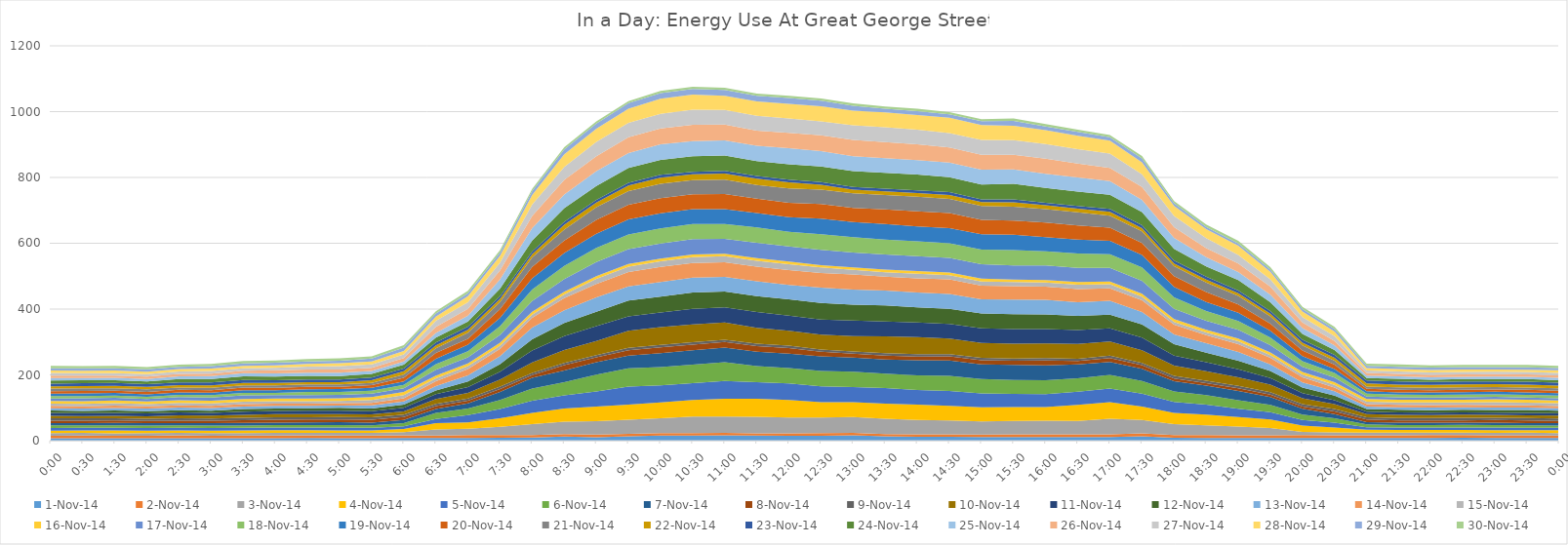
| Category | 01-Nov-14 | 02-Nov-14 | 03-Nov-14 | 04-Nov-14 | 05-Nov-14 | 06-Nov-14 | 07-Nov-14 | 08-Nov-14 | 09-Nov-14 | 10-Nov-14 | 11-Nov-14 | 12-Nov-14 | 13-Nov-14 | 14-Nov-14 | 15-Nov-14 | 16-Nov-14 | 17-Nov-14 | 18-Nov-14 | 19-Nov-14 | 20-Nov-14 | 21-Nov-14 | 22-Nov-14 | 23-Nov-14 | 24-Nov-14 | 25-Nov-14 | 26-Nov-14 | 27-Nov-14 | 28-Nov-14 | 29-Nov-14 | 30-Nov-14 |
|---|---|---|---|---|---|---|---|---|---|---|---|---|---|---|---|---|---|---|---|---|---|---|---|---|---|---|---|---|---|---|
| 0.0 | 7.4 | 7.7 | 7.6 | 7.9 | 8.2 | 7.5 | 7.4 | 7.1 | 7.5 | 7.2 | 8.7 | 7.3 | 7.1 | 7.1 | 7.1 | 7.6 | 8.1 | 6.8 | 7.4 | 7.5 | 8.1 | 6.8 | 8.5 | 9.1 | 7.9 | 7.1 | 7.9 | 7.4 | 7.3 | 6.9 |
| 0.020833333333333332 | 7.4 | 8.3 | 8 | 7.5 | 7.9 | 7.3 | 7.3 | 7.2 | 7.2 | 6.9 | 8.4 | 7.1 | 7.2 | 7 | 7.1 | 8.2 | 8.6 | 7 | 8 | 7.6 | 7.7 | 7.1 | 8.7 | 8.8 | 6.9 | 7.5 | 7.5 | 7.2 | 7.4 | 6.7 |
| 0.0625 | 7.5 | 7.5 | 7.5 | 8.4 | 8.5 | 7.5 | 7 | 7.3 | 7.2 | 7.2 | 8.8 | 7.4 | 7.5 | 7.2 | 7.9 | 8 | 7.8 | 7.2 | 7.6 | 7.1 | 7.5 | 7.4 | 8.5 | 8.4 | 7 | 7.2 | 7.4 | 7.5 | 7.1 | 7.3 |
| 0.08333333333333333 | 7.5 | 7.3 | 7.9 | 7.8 | 7.9 | 7.4 | 7.4 | 6.8 | 7 | 7.4 | 8.5 | 7.1 | 7.5 | 6.8 | 6.9 | 7.8 | 7.8 | 6.9 | 7.4 | 7.4 | 7.5 | 7.6 | 8.3 | 8.4 | 7.3 | 7.1 | 7.3 | 7.4 | 7.4 | 7 |
| 0.10416666666666667 | 7.4 | 8.6 | 7.7 | 7.5 | 7.8 | 7.4 | 7.2 | 7.4 | 7.5 | 8.5 | 9.1 | 6.8 | 7.6 | 6.9 | 7.5 | 7.8 | 9.9 | 6.8 | 7.5 | 7.6 | 7.1 | 7 | 8.5 | 10.4 | 8.4 | 7.1 | 7.6 | 7 | 7.1 | 6.7 |
| 0.125 | 7.2 | 7.7 | 8 | 7.6 | 8.2 | 7.4 | 7.4 | 7 | 7 | 8.5 | 8.5 | 6.9 | 7.7 | 7.1 | 7 | 8 | 9.9 | 7.3 | 7.5 | 7.8 | 7.4 | 7.1 | 8.5 | 10.5 | 9.3 | 7.4 | 8.2 | 7 | 7.6 | 6.8 |
| 0.14583333333333334 | 7.6 | 7.6 | 7.9 | 7.7 | 8.2 | 7.2 | 7.9 | 7.8 | 7.6 | 9 | 9.9 | 7.7 | 7.5 | 7.7 | 7.1 | 8.6 | 10.7 | 7.6 | 7.7 | 8.2 | 6.9 | 7.3 | 9 | 11 | 9.7 | 7.5 | 7.7 | 7.3 | 7.1 | 7.2 |
| 0.16666666666666666 | 7.7 | 7.9 | 8 | 8.3 | 7.8 | 7.8 | 7.4 | 8.8 | 7.6 | 9.4 | 9.8 | 7.4 | 7.8 | 7.1 | 7.2 | 8.5 | 10 | 7 | 7.6 | 7.6 | 7.6 | 7.2 | 8.4 | 10.9 | 9.7 | 9.4 | 7.7 | 7.4 | 7.7 | 7.3 |
| 0.1875 | 8 | 8 | 7.7 | 8.1 | 8.2 | 7.6 | 7.7 | 8.8 | 7.3 | 9.5 | 10.3 | 7.3 | 7.6 | 6.8 | 6.8 | 8.1 | 11 | 9.3 | 8 | 7.4 | 7.5 | 6.8 | 8.4 | 10.7 | 9.7 | 9.7 | 9.2 | 7.5 | 7.4 | 7.8 |
| 0.20833333333333334 | 7.7 | 8.2 | 7.8 | 7.4 | 8.6 | 7.5 | 9.2 | 8.3 | 7.2 | 9.1 | 9.8 | 9.1 | 6.9 | 7.1 | 7 | 8.3 | 10.1 | 9.2 | 8.3 | 7 | 7.4 | 6.8 | 8 | 10.6 | 10.1 | 9.4 | 10.3 | 9 | 7.9 | 7 |
| 0.22916666666666666 | 7.3 | 8.4 | 7.9 | 7.6 | 8.4 | 7 | 8.5 | 8.8 | 7.3 | 8.8 | 9.8 | 8.3 | 9.2 | 7.3 | 9.1 | 8.8 | 10.5 | 8.7 | 9.3 | 7.8 | 7.1 | 7.5 | 8.2 | 11.3 | 9.1 | 9.6 | 9.9 | 9.2 | 8.8 | 6.8 |
| 0.25 | 8.1 | 8.1 | 9.5 | 9.5 | 8.5 | 9.7 | 9.3 | 9 | 7.7 | 9.2 | 11.3 | 9.4 | 10.3 | 9.3 | 9.7 | 9.2 | 11.5 | 10.4 | 10.5 | 11.1 | 9.7 | 9.9 | 8.7 | 11.4 | 9.7 | 10.6 | 10.9 | 10.4 | 10.2 | 7.6 |
| 0.2708333333333333 | 8 | 7.5 | 18.7 | 19.2 | 12.8 | 17.9 | 12.1 | 8.9 | 7.1 | 14.6 | 14.5 | 11.3 | 13.6 | 14.2 | 9.4 | 8 | 17.8 | 16.7 | 16.9 | 17.5 | 14 | 9.2 | 8.3 | 15 | 14.1 | 18.4 | 18.8 | 12.6 | 9.3 | 6.8 |
| 0.2916666666666667 | 8.4 | 8.3 | 19.3 | 19.7 | 22.3 | 19.6 | 15.5 | 8.2 | 7.1 | 16.7 | 17.6 | 17.1 | 18.4 | 19.4 | 9.2 | 8.3 | 18.2 | 18.8 | 19.6 | 18.3 | 17.9 | 9.3 | 9.2 | 15.7 | 17.9 | 20.5 | 20.1 | 18.4 | 9.3 | 7.4 |
| 0.3125 | 8.9 | 7.8 | 25.2 | 26.1 | 28.4 | 27.1 | 24.5 | 8.7 | 7.9 | 21 | 24.4 | 22.3 | 24.6 | 22.5 | 9.8 | 8.5 | 24 | 26.3 | 25.5 | 26.5 | 21.8 | 9.1 | 8.4 | 23.2 | 27.8 | 27.2 | 24.2 | 20.2 | 9.7 | 7.6 |
| 0.3333333333333333 | 9.8 | 7.1 | 33.6 | 34.3 | 36.9 | 36.9 | 32.4 | 7.9 | 6.8 | 32.2 | 36.1 | 34.2 | 35.8 | 29.6 | 9 | 8.9 | 32.9 | 35.1 | 34 | 34.5 | 29.1 | 9.5 | 8.5 | 32.7 | 38.3 | 37.2 | 34.4 | 29.1 | 11.6 | 7 |
| 0.3541666666666667 | 12.5 | 7.7 | 37.6 | 39.9 | 39.9 | 40.3 | 35.4 | 16 | 7 | 39.1 | 42.7 | 39.6 | 38.8 | 36.9 | 11.3 | 7.9 | 38.3 | 40.4 | 39 | 38 | 32.9 | 14.8 | 8.9 | 41.5 | 41.7 | 44.2 | 39.9 | 37.9 | 14.9 | 6.8 |
| 0.375 | 10.6 | 8 | 40.6 | 44.3 | 46.5 | 50.8 | 37.4 | 15 | 6.9 | 42.7 | 45.7 | 43.7 | 43.3 | 40.5 | 15.9 | 8.1 | 43 | 43 | 42.8 | 42.6 | 38 | 14.3 | 8.2 | 42.4 | 45 | 45.4 | 43.4 | 40 | 15.4 | 6.6 |
| 0.3958333333333333 | 13.7 | 7.1 | 42.9 | 45.8 | 54.7 | 55.7 | 38.5 | 16.6 | 7.2 | 51.9 | 44 | 48.1 | 43 | 43.1 | 16.8 | 7.6 | 45.5 | 44.6 | 45.5 | 44.7 | 41.3 | 17.2 | 8.2 | 44.9 | 45.6 | 47.7 | 44.3 | 42.6 | 16.8 | 6.5 |
| 0.4166666666666667 | 15.4 | 7.9 | 44.5 | 48.6 | 51.7 | 55.9 | 42.2 | 17.7 | 7.1 | 53.9 | 44.8 | 48.1 | 44.7 | 45.5 | 17.5 | 7.9 | 45.6 | 46.1 | 45.9 | 45.9 | 43.9 | 18.8 | 8.4 | 45.1 | 48 | 47.9 | 44.7 | 45.3 | 17.4 | 6.5 |
| 0.4375 | 15.3 | 7.3 | 50.9 | 49.9 | 51.7 | 55.7 | 43.7 | 17.5 | 7.1 | 54.4 | 47.3 | 49.4 | 45.2 | 44.9 | 17.6 | 7.8 | 46.6 | 46.2 | 45.5 | 45 | 42.6 | 17.9 | 7.9 | 46.8 | 46.5 | 49.5 | 46 | 45.4 | 17.5 | 6.4 |
| 0.4583333333333333 | 16.1 | 7.7 | 49.4 | 54.1 | 54.5 | 56.6 | 44.5 | 16.8 | 6.9 | 52.5 | 46 | 48.5 | 44.5 | 44 | 18.5 | 7.8 | 45.1 | 45.2 | 44.8 | 46.4 | 43.8 | 18 | 8 | 47.2 | 45.8 | 48.1 | 44.1 | 43.5 | 17.5 | 6.8 |
| 0.4791666666666667 | 15.5 | 7 | 50.4 | 54.4 | 50.6 | 48.4 | 44 | 17.2 | 7.2 | 47.9 | 48.5 | 48.5 | 44.8 | 44.4 | 18.1 | 8 | 46.7 | 46.2 | 43.7 | 43.8 | 42 | 18.9 | 8.5 | 45 | 46.4 | 46.3 | 44.7 | 44.1 | 17.3 | 6.6 |
| 0.5 | 15.1 | 7 | 48.6 | 53 | 50.3 | 46.6 | 44 | 16.8 | 7.5 | 45.5 | 45.3 | 49.8 | 43.9 | 45.4 | 17.5 | 7.9 | 46.1 | 44.7 | 44 | 43.6 | 44.1 | 18.4 | 8.2 | 46.9 | 48.8 | 46.5 | 43.6 | 44.7 | 17.7 | 7 |
| 0.5208333333333334 | 14.8 | 8 | 47.8 | 46.8 | 47.9 | 46.9 | 44.3 | 14.1 | 6.7 | 45.2 | 45.8 | 50.3 | 46.4 | 44.6 | 16.8 | 7.2 | 46.4 | 47.3 | 47.8 | 44.1 | 43.6 | 15.1 | 7.8 | 47.3 | 46.7 | 48.1 | 42.8 | 45.6 | 17.1 | 6.6 |
| 0.5416666666666666 | 16.1 | 7.4 | 48.5 | 44.9 | 46 | 46.9 | 42.6 | 11.7 | 6.9 | 46.8 | 47.1 | 48.1 | 46.4 | 45.5 | 14.4 | 7.7 | 45.1 | 46.1 | 46.2 | 43.1 | 44.2 | 11.1 | 8 | 48.5 | 44.9 | 49.8 | 44.5 | 44.6 | 15 | 7 |
| 0.5625 | 13 | 7.1 | 46.6 | 46.2 | 47 | 44.1 | 43 | 11.7 | 7.2 | 51.5 | 45 | 48.8 | 45.1 | 42.5 | 12.9 | 8.1 | 46.4 | 44.6 | 48 | 43.9 | 43.8 | 11.4 | 8.1 | 48 | 44.2 | 49.2 | 45.5 | 44.6 | 11.7 | 6.6 |
| 0.5833333333333334 | 11.9 | 7.7 | 43.4 | 46.7 | 44.3 | 44.3 | 45.8 | 11.7 | 7 | 52.1 | 44.2 | 46.2 | 45.3 | 42.5 | 14 | 8.2 | 45.8 | 44.6 | 45.5 | 46 | 44.1 | 11.2 | 8.3 | 48 | 43.7 | 48.6 | 43.8 | 45.1 | 11.7 | 7 |
| 0.6041666666666666 | 11.5 | 7.4 | 42.3 | 44.9 | 44.8 | 46.4 | 46.3 | 12.5 | 7.2 | 47 | 44.5 | 45.7 | 45.4 | 44.4 | 12.8 | 7.9 | 44.5 | 44.5 | 46.2 | 45.9 | 42.4 | 12 | 8.7 | 45.9 | 44.2 | 45.6 | 43.7 | 46.6 | 10.7 | 6.6 |
| 0.625 | 11.2 | 7.6 | 39.8 | 43.1 | 41.9 | 43.6 | 44.9 | 12.1 | 7.3 | 45.3 | 44.6 | 45.4 | 43 | 41.1 | 13.1 | 8.5 | 43.6 | 45 | 46.2 | 43.8 | 42.1 | 11.8 | 8.1 | 45.1 | 45.3 | 45.1 | 45.7 | 45.1 | 11.5 | 6.4 |
| 0.6458333333333334 | 11.2 | 8.1 | 40.4 | 42.3 | 40 | 42.6 | 45.9 | 12.1 | 7.1 | 45.3 | 44.1 | 45.4 | 44.2 | 41.1 | 12.2 | 7.8 | 42.9 | 46.7 | 46.2 | 43.5 | 41.8 | 13.7 | 8.7 | 47.4 | 44 | 44.4 | 44.6 | 43.4 | 14.9 | 6.9 |
| 0.6666666666666666 | 11.1 | 8.4 | 41.1 | 41.7 | 39.1 | 42.5 | 44.9 | 14.6 | 7.4 | 44.7 | 44 | 44.5 | 44.2 | 39.6 | 13.1 | 7.3 | 44.6 | 43 | 43 | 43.8 | 41 | 11.8 | 7.7 | 44.8 | 43.5 | 45.7 | 44.3 | 42.2 | 11.4 | 7.1 |
| 0.6875 | 11.1 | 8 | 41.1 | 48.7 | 40.1 | 40.8 | 42.3 | 10.2 | 6.8 | 44.7 | 42.5 | 43 | 41.7 | 39.8 | 13.1 | 8.3 | 42.8 | 43.7 | 42.3 | 42.8 | 40.1 | 11 | 8.5 | 43.7 | 42.7 | 42.5 | 43.4 | 41.3 | 11.3 | 6.9 |
| 0.7083333333333334 | 10.9 | 8.5 | 47.1 | 50.2 | 41.6 | 41.6 | 39.7 | 11.7 | 7.3 | 42.7 | 40 | 41.9 | 42.1 | 38 | 12.3 | 8.2 | 41.2 | 41.3 | 41 | 40 | 36.1 | 12.4 | 9 | 42.3 | 41.5 | 40.5 | 43.2 | 39.3 | 10.5 | 7.1 |
| 0.7291666666666666 | 13.5 | 8.6 | 40.9 | 40.8 | 39 | 39 | 36.8 | 11.1 | 6.9 | 38.1 | 38.9 | 39.5 | 38.1 | 35.2 | 11.7 | 8.7 | 38.9 | 40.7 | 38 | 36.7 | 35.1 | 9.8 | 9.1 | 39.4 | 37.2 | 39.1 | 38.9 | 36.3 | 11.8 | 7.3 |
| 0.75 | 9.1 | 8.2 | 33.1 | 33.9 | 33.7 | 31.8 | 31.3 | 8 | 7.7 | 31.4 | 30.6 | 34.2 | 30.2 | 29.1 | 8.6 | 8.4 | 31.7 | 34.2 | 32.1 | 33 | 29.8 | 8.6 | 8.8 | 35.8 | 32.7 | 32.9 | 34.2 | 29.9 | 8.2 | 6.8 |
| 0.7708333333333334 | 8.5 | 8.2 | 30.2 | 32.7 | 30.4 | 28.6 | 28.8 | 7.7 | 6.8 | 29 | 27.5 | 29.3 | 28.7 | 24.6 | 8.2 | 8.2 | 27.4 | 29.4 | 27 | 30.6 | 29.1 | 8.9 | 8.6 | 31.1 | 28.2 | 27.6 | 30 | 27.4 | 7.2 | 6.8 |
| 0.7916666666666666 | 8.5 | 8 | 26.7 | 28.3 | 25.7 | 25.5 | 28.7 | 7.8 | 7.2 | 26.2 | 24.3 | 26.1 | 26.7 | 23.8 | 8.4 | 8.4 | 26.6 | 27.1 | 24.6 | 25.7 | 25.5 | 8.5 | 8.3 | 31.2 | 25.1 | 25.7 | 26.1 | 27.7 | 7.2 | 7.8 |
| 0.8125 | 8.1 | 7.9 | 22.3 | 25.8 | 22.8 | 22.3 | 23.4 | 7.1 | 7.4 | 23.3 | 20.3 | 21 | 20.2 | 19.8 | 8.4 | 8.2 | 21.8 | 23.3 | 20.4 | 21.8 | 21.9 | 8.2 | 8.7 | 26.1 | 23.5 | 24.1 | 22.6 | 22.4 | 6.7 | 7.3 |
| 0.8333333333333334 | 8.3 | 8.5 | 10.1 | 19.2 | 17.1 | 16.2 | 17.3 | 6.9 | 7.3 | 18.1 | 15.5 | 16.7 | 16 | 15.4 | 8.4 | 7.8 | 15.7 | 17 | 15.9 | 16.6 | 15.6 | 8.4 | 8.7 | 17.9 | 17.8 | 16.6 | 16.7 | 17.1 | 7.1 | 7 |
| 0.8541666666666666 | 8.5 | 7.8 | 8.6 | 14.9 | 14.7 | 13.4 | 12.7 | 8 | 7.5 | 14.9 | 12.3 | 13.4 | 13.4 | 11.1 | 8.5 | 7.8 | 14.5 | 13.8 | 12.2 | 13 | 12 | 8.9 | 9.2 | 14.6 | 13.7 | 13.8 | 14.9 | 13.4 | 7.4 | 7 |
| 0.875 | 7.9 | 8.4 | 8.4 | 8.3 | 7.9 | 8.6 | 7.1 | 7.7 | 7.1 | 9 | 7.5 | 8.5 | 7.3 | 7.2 | 7.9 | 8 | 7.6 | 8.3 | 7.5 | 7.7 | 6.9 | 9.1 | 8.8 | 7.5 | 7.5 | 8 | 7.8 | 7.2 | 6.7 | 6.8 |
| 0.8958333333333334 | 8.4 | 8.2 | 7.9 | 8.1 | 7.6 | 7.5 | 6.9 | 7.1 | 7.5 | 9.1 | 7.5 | 8.5 | 7.3 | 7.1 | 7.8 | 8 | 7.3 | 7.9 | 7.2 | 8.2 | 7.4 | 8.2 | 9.3 | 7.9 | 7.3 | 7.9 | 7.5 | 7.4 | 6.8 | 7.3 |
| 0.9166666666666666 | 8.4 | 8.6 | 7.7 | 8.2 | 7.3 | 7.5 | 6.9 | 7 | 7.1 | 8.9 | 7.6 | 7.7 | 8 | 7.1 | 8.3 | 8 | 6.8 | 7.8 | 7.4 | 7.3 | 7.4 | 8.6 | 8.7 | 7.1 | 6.9 | 7.6 | 7.7 | 7.1 | 7.2 | 6.7 |
| 0.9375 | 8.9 | 8.2 | 7.7 | 8 | 7.5 | 7.5 | 7 | 7 | 8 | 9.2 | 7.2 | 7.8 | 7.3 | 7.3 | 7.9 | 8.1 | 7.1 | 8.1 | 7.6 | 7.5 | 7.2 | 9.2 | 8.5 | 7.3 | 7.1 | 7.4 | 7.2 | 7.6 | 7.2 | 6.7 |
| 0.9583333333333334 | 8.3 | 8 | 7.7 | 8.1 | 8.1 | 7.5 | 7.3 | 7.7 | 7.1 | 8.7 | 6.9 | 8 | 7.3 | 7.5 | 8.7 | 8.8 | 7.5 | 7.6 | 7.8 | 7.3 | 7.4 | 8.3 | 8.7 | 7.3 | 7 | 7.5 | 7.3 | 7.2 | 7.1 | 7 |
| 0.9791666666666666 | 8.2 | 8.1 | 7.8 | 7.8 | 7.3 | 7.4 | 6.8 | 8 | 7.3 | 8.3 | 7.8 | 8.4 | 7.2 | 7.2 | 8.3 | 8.3 | 6.8 | 8.1 | 7.9 | 7.5 | 7.1 | 9.1 | 8.7 | 7.7 | 6.8 | 7.7 | 7.2 | 7 | 6.9 | 7.9 |
| 0.0 | 8.2 | 7.5 | 7.4 | 8.4 | 7.5 | 7.2 | 6.9 | 7.2 | 6.7 | 9.1 | 7.6 | 7.3 | 7.1 | 7.3 | 8.3 | 8.3 | 7 | 7.9 | 7.5 | 7.5 | 7.2 | 8.5 | 8.4 | 7.6 | 7.3 | 7.8 | 7.3 | 7.7 | 6.8 | 7 |